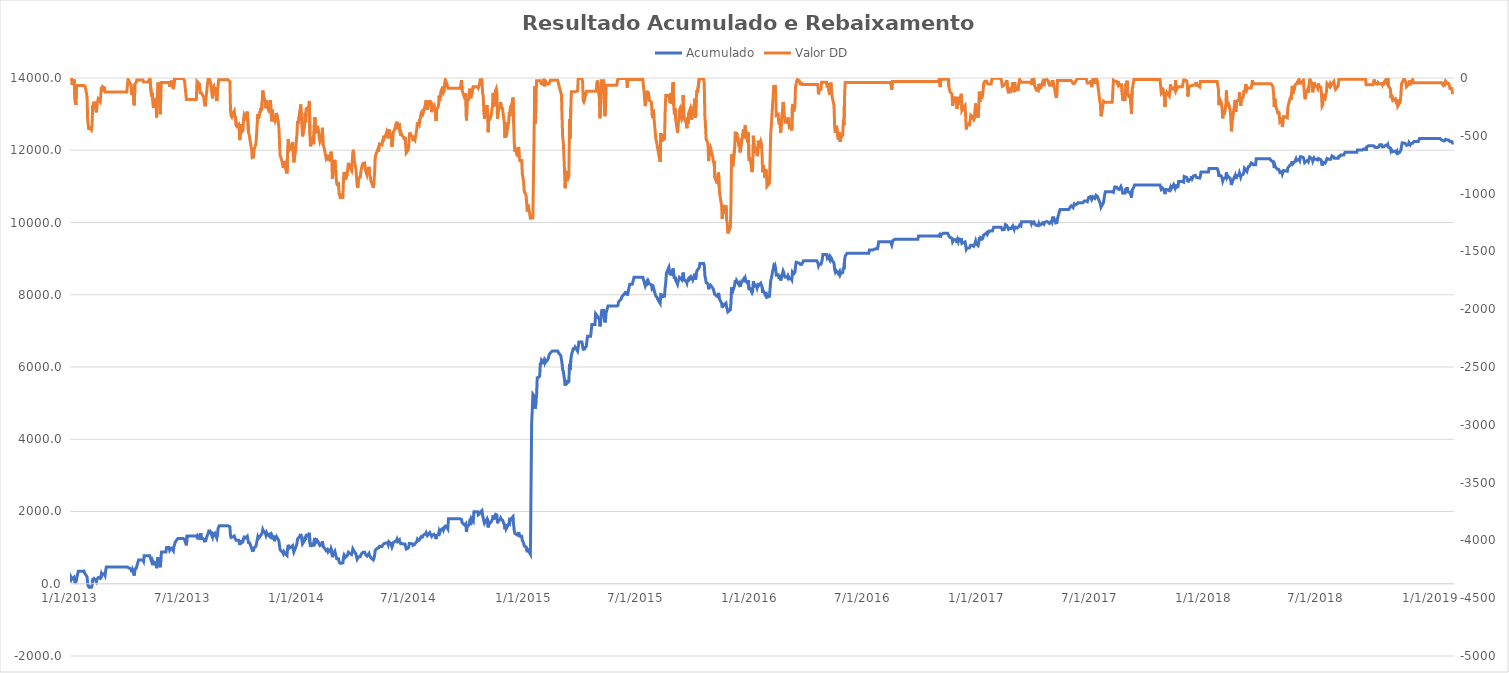
| Category | Acumulado |
|---|---|
| 1/1/13 | 35.924 |
| 1/2/13 | 193.591 |
| 1/3/13 | 193.591 |
| 1/4/13 | 134.082 |
| 1/7/13 | 181.261 |
| 1/8/13 | 203.592 |
| 1/9/13 | -5.087 |
| 1/10/13 | -28.987 |
| 1/11/13 | 139.129 |
| 1/14/13 | 346.97 |
| 1/15/13 | 346.97 |
| 1/16/13 | 346.97 |
| 1/17/13 | 346.97 |
| 1/18/13 | 346.97 |
| 1/21/13 | 346.97 |
| 1/22/13 | 353.367 |
| 1/23/13 | 353.367 |
| 1/24/13 | 295.1 |
| 1/25/13 | 278.069 |
| 1/28/13 | 193.644 |
| 1/29/13 | -18.116 |
| 1/30/13 | -22.686 |
| 1/31/13 | -94.511 |
| 2/1/13 | -76.66 |
| 2/4/13 | -96.696 |
| 2/5/13 | -59.321 |
| 2/6/13 | 119.973 |
| 2/7/13 | 109.122 |
| 2/8/13 | 148.708 |
| 2/11/13 | 85.345 |
| 2/12/13 | 56.277 |
| 2/13/13 | 130.277 |
| 2/14/13 | 148.881 |
| 2/15/13 | 171.766 |
| 2/18/13 | 147.479 |
| 2/19/13 | 194.505 |
| 2/20/13 | 275.873 |
| 2/21/13 | 232.84 |
| 2/22/13 | 278.613 |
| 2/25/13 | 269.126 |
| 2/26/13 | 232.235 |
| 2/27/13 | 373.669 |
| 2/28/13 | 463.713 |
| 3/1/13 | 463.713 |
| 3/4/13 | 463.713 |
| 3/5/13 | 463.713 |
| 3/6/13 | 463.713 |
| 3/7/13 | 463.713 |
| 3/8/13 | 463.713 |
| 3/10/13 | 463.713 |
| 3/11/13 | 463.713 |
| 3/12/13 | 463.713 |
| 3/13/13 | 463.713 |
| 3/14/13 | 463.713 |
| 3/17/13 | 463.713 |
| 3/18/13 | 463.713 |
| 3/19/13 | 463.713 |
| 3/20/13 | 463.713 |
| 3/21/13 | 463.713 |
| 3/24/13 | 463.713 |
| 3/25/13 | 463.713 |
| 3/26/13 | 463.713 |
| 3/27/13 | 463.713 |
| 3/28/13 | 463.713 |
| 3/31/13 | 463.713 |
| 4/1/13 | 463.713 |
| 4/2/13 | 463.713 |
| 4/3/13 | 463.713 |
| 4/4/13 | 452.145 |
| 4/7/13 | 420.279 |
| 4/8/13 | 426.033 |
| 4/9/13 | 402.838 |
| 4/10/13 | 320.18 |
| 4/11/13 | 385.693 |
| 4/14/13 | 227.54 |
| 4/15/13 | 411.034 |
| 4/16/13 | 414.414 |
| 4/17/13 | 423.625 |
| 4/18/13 | 446.005 |
| 4/21/13 | 659.697 |
| 4/22/13 | 659.697 |
| 4/23/13 | 659.697 |
| 4/24/13 | 659.697 |
| 4/25/13 | 659.697 |
| 4/28/13 | 659.697 |
| 4/29/13 | 624.514 |
| 4/30/13 | 773.092 |
| 5/1/13 | 773.092 |
| 5/2/13 | 773.092 |
| 5/5/13 | 773.092 |
| 5/6/13 | 773.092 |
| 5/7/13 | 773.092 |
| 5/8/13 | 773.092 |
| 5/9/13 | 772.973 |
| 5/12/13 | 609.939 |
| 5/13/13 | 646.454 |
| 5/14/13 | 640.856 |
| 5/15/13 | 513.25 |
| 5/16/13 | 596.945 |
| 5/19/13 | 562.109 |
| 5/20/13 | 430.948 |
| 5/21/13 | 599.901 |
| 5/22/13 | 733.536 |
| 5/23/13 | 708.63 |
| 5/26/13 | 459.218 |
| 5/27/13 | 734.531 |
| 5/28/13 | 879.025 |
| 5/29/13 | 879.025 |
| 5/30/13 | 879.025 |
| 6/2/13 | 879.025 |
| 6/3/13 | 879.025 |
| 6/4/13 | 879.025 |
| 6/5/13 | 1004.132 |
| 6/6/13 | 1004.132 |
| 6/9/13 | 1004.132 |
| 6/10/13 | 929.674 |
| 6/11/13 | 960.423 |
| 6/12/13 | 941.989 |
| 6/13/13 | 981.499 |
| 6/16/13 | 908.223 |
| 6/17/13 | 1035.223 |
| 6/18/13 | 1029.928 |
| 6/19/13 | 1153.081 |
| 6/20/13 | 1153.081 |
| 6/23/13 | 1249.296 |
| 6/24/13 | 1249.296 |
| 6/25/13 | 1249.296 |
| 6/26/13 | 1249.296 |
| 6/27/13 | 1249.296 |
| 6/30/13 | 1249.296 |
| 7/1/13 | 1249.296 |
| 7/2/13 | 1249.296 |
| 7/3/13 | 1249.296 |
| 7/4/13 | 1223.68 |
| 7/7/13 | 1063.529 |
| 7/8/13 | 1318.768 |
| 7/9/13 | 1318.768 |
| 7/10/13 | 1318.768 |
| 7/11/13 | 1318.768 |
| 7/14/13 | 1318.768 |
| 7/15/13 | 1318.768 |
| 7/16/13 | 1318.768 |
| 7/17/13 | 1318.768 |
| 7/18/13 | 1318.768 |
| 7/21/13 | 1318.768 |
| 7/22/13 | 1318.768 |
| 7/23/13 | 1318.768 |
| 7/24/13 | 1290.014 |
| 7/25/13 | 1338.351 |
| 7/28/13 | 1286.478 |
| 7/29/13 | 1210.967 |
| 7/30/13 | 1403.735 |
| 7/31/13 | 1276.597 |
| 8/1/13 | 1266.505 |
| 8/4/13 | 1234.441 |
| 8/5/13 | 1181.067 |
| 8/6/13 | 1159.601 |
| 8/7/13 | 1188.206 |
| 8/8/13 | 1254.797 |
| 8/11/13 | 1400.543 |
| 8/12/13 | 1460.644 |
| 8/13/13 | 1460.644 |
| 8/14/13 | 1462.845 |
| 8/15/13 | 1420.37 |
| 8/18/13 | 1286.429 |
| 8/19/13 | 1381.735 |
| 8/20/13 | 1390.51 |
| 8/21/13 | 1350.308 |
| 8/22/13 | 1384.157 |
| 8/25/13 | 1263.657 |
| 8/26/13 | 1355.015 |
| 8/27/13 | 1527.171 |
| 8/28/13 | 1512.417 |
| 8/29/13 | 1608.705 |
| 9/1/13 | 1608.705 |
| 9/2/13 | 1608.705 |
| 9/3/13 | 1608.705 |
| 9/4/13 | 1608.705 |
| 9/5/13 | 1608.705 |
| 9/8/13 | 1608.705 |
| 9/9/13 | 1608.705 |
| 9/10/13 | 1608.705 |
| 9/11/13 | 1608.705 |
| 9/12/13 | 1608.705 |
| 9/15/13 | 1575.956 |
| 9/16/13 | 1332.528 |
| 9/17/13 | 1281.831 |
| 9/18/13 | 1272.181 |
| 9/19/13 | 1294.046 |
| 9/22/13 | 1323.328 |
| 9/23/13 | 1265.939 |
| 9/24/13 | 1277.844 |
| 9/25/13 | 1202.712 |
| 9/26/13 | 1190.579 |
| 9/29/13 | 1206.885 |
| 9/30/13 | 1153.379 |
| 10/1/13 | 1071.219 |
| 10/2/13 | 1209.881 |
| 10/3/13 | 1133.276 |
| 10/6/13 | 1152.96 |
| 10/7/13 | 1254.446 |
| 10/8/13 | 1290.473 |
| 10/9/13 | 1290.508 |
| 10/10/13 | 1268.915 |
| 10/13/13 | 1318.459 |
| 10/14/13 | 1325.524 |
| 10/15/13 | 1134.928 |
| 10/16/13 | 1121.393 |
| 10/17/13 | 1124.182 |
| 10/20/13 | 985.223 |
| 10/21/13 | 919.876 |
| 10/22/13 | 928.524 |
| 10/23/13 | 924.35 |
| 10/24/13 | 991.152 |
| 10/27/13 | 1038.973 |
| 10/28/13 | 1044.533 |
| 10/29/13 | 1207.845 |
| 10/30/13 | 1297.535 |
| 10/31/13 | 1255.377 |
| 11/4/13 | 1347.261 |
| 11/5/13 | 1326.927 |
| 11/6/13 | 1406.265 |
| 11/7/13 | 1500.177 |
| 11/8/13 | 1461.247 |
| 11/11/13 | 1402.749 |
| 11/12/13 | 1346.999 |
| 11/13/13 | 1414.575 |
| 11/14/13 | 1388.936 |
| 11/15/13 | 1348.174 |
| 11/18/13 | 1308.44 |
| 11/19/13 | 1415.948 |
| 11/20/13 | 1364.153 |
| 11/21/13 | 1234.545 |
| 11/22/13 | 1334.999 |
| 11/25/13 | 1233.176 |
| 11/26/13 | 1267.975 |
| 11/27/13 | 1239.518 |
| 11/28/13 | 1254.329 |
| 11/29/13 | 1306.237 |
| 12/2/13 | 1221.273 |
| 12/3/13 | 1176.568 |
| 12/4/13 | 1045.498 |
| 12/5/13 | 934.694 |
| 12/6/13 | 925.286 |
| 12/9/13 | 864.209 |
| 12/10/13 | 830.544 |
| 12/11/13 | 888.557 |
| 12/12/13 | 876.387 |
| 12/13/13 | 837.48 |
| 12/16/13 | 782.126 |
| 12/17/13 | 993.294 |
| 12/18/13 | 1079.076 |
| 12/19/13 | 1025.88 |
| 12/20/13 | 989.168 |
| 12/23/13 | 1019.983 |
| 12/24/13 | 1030.455 |
| 12/25/13 | 1054.839 |
| 12/26/13 | 958.303 |
| 12/27/13 | 878.727 |
| 12/30/13 | 1004.161 |
| 12/31/13 | 1002.961 |
| 1/1/14 | 1115.296 |
| 1/2/14 | 1238.192 |
| 1/3/14 | 1214.62 |
| 1/6/14 | 1325.507 |
| 1/7/14 | 1379.887 |
| 1/8/14 | 1291.484 |
| 1/9/14 | 1197.554 |
| 1/10/14 | 1103.803 |
| 1/13/14 | 1189.004 |
| 1/14/14 | 1306.648 |
| 1/15/14 | 1224.102 |
| 1/16/14 | 1342.968 |
| 1/17/14 | 1346.812 |
| 1/20/14 | 1359.514 |
| 1/21/14 | 1410.457 |
| 1/22/14 | 1114.479 |
| 1/23/14 | 1017.781 |
| 1/24/14 | 1080.785 |
| 1/27/14 | 1099.776 |
| 1/28/14 | 1035.05 |
| 1/29/14 | 1205.057 |
| 1/30/14 | 1269.369 |
| 1/31/14 | 1131.593 |
| 2/3/14 | 1194.559 |
| 2/4/14 | 1188.778 |
| 2/5/14 | 1134.403 |
| 2/6/14 | 1088.989 |
| 2/7/14 | 1059.173 |
| 2/10/14 | 1102.17 |
| 2/11/14 | 1177.441 |
| 2/12/14 | 1032.708 |
| 2/13/14 | 1022.67 |
| 2/14/14 | 995.925 |
| 2/17/14 | 914.381 |
| 2/18/14 | 926.591 |
| 2/19/14 | 945.398 |
| 2/20/14 | 895.881 |
| 2/21/14 | 931.92 |
| 2/24/14 | 890.538 |
| 2/25/14 | 970.921 |
| 2/26/14 | 923.21 |
| 2/27/14 | 736.19 |
| 2/28/14 | 807.268 |
| 3/3/14 | 900.887 |
| 3/4/14 | 906.547 |
| 3/5/14 | 761.431 |
| 3/6/14 | 694.755 |
| 3/7/14 | 685.513 |
| 3/9/14 | 692.189 |
| 3/10/14 | 598.019 |
| 3/11/14 | 611.66 |
| 3/12/14 | 564.893 |
| 3/13/14 | 585.137 |
| 3/16/14 | 577.559 |
| 3/17/14 | 732.176 |
| 3/18/14 | 796.134 |
| 3/19/14 | 766.572 |
| 3/20/14 | 728.899 |
| 3/23/14 | 775.247 |
| 3/24/14 | 833.168 |
| 3/25/14 | 874.726 |
| 3/26/14 | 880.777 |
| 3/27/14 | 838.737 |
| 3/30/14 | 808.327 |
| 3/31/14 | 876.545 |
| 4/1/14 | 965.616 |
| 4/2/14 | 988.195 |
| 4/3/14 | 903.035 |
| 4/6/14 | 823.306 |
| 4/7/14 | 749.98 |
| 4/8/14 | 680.433 |
| 4/9/14 | 657.731 |
| 4/10/14 | 742.077 |
| 4/13/14 | 749.561 |
| 4/14/14 | 799.079 |
| 4/15/14 | 828.322 |
| 4/16/14 | 821.824 |
| 4/17/14 | 868.009 |
| 4/20/14 | 873.316 |
| 4/21/14 | 830.567 |
| 4/22/14 | 796.632 |
| 4/23/14 | 797.633 |
| 4/24/14 | 767.229 |
| 4/27/14 | 840.119 |
| 4/28/14 | 778.713 |
| 4/29/14 | 758.162 |
| 4/30/14 | 722.762 |
| 5/1/14 | 719.643 |
| 5/4/14 | 659.574 |
| 5/5/14 | 700.276 |
| 5/6/14 | 784.001 |
| 5/7/14 | 913.601 |
| 5/8/14 | 943.962 |
| 5/11/14 | 987.819 |
| 5/12/14 | 969.931 |
| 5/13/14 | 998.584 |
| 5/14/14 | 1037.97 |
| 5/15/14 | 1032.07 |
| 5/18/14 | 1029.508 |
| 5/19/14 | 1067.917 |
| 5/20/14 | 1084.265 |
| 5/21/14 | 1109.88 |
| 5/22/14 | 1091.421 |
| 5/25/14 | 1131.537 |
| 5/26/14 | 1150.544 |
| 5/27/14 | 1140.139 |
| 5/28/14 | 1086.262 |
| 5/29/14 | 1163.4 |
| 6/1/14 | 1113.689 |
| 6/2/14 | 1128.549 |
| 6/3/14 | 1012.635 |
| 6/4/14 | 1058.69 |
| 6/5/14 | 1136.16 |
| 6/8/14 | 1174.387 |
| 6/9/14 | 1198.314 |
| 6/10/14 | 1189.242 |
| 6/11/14 | 1230.581 |
| 6/12/14 | 1168.97 |
| 6/15/14 | 1218.155 |
| 6/16/14 | 1139.579 |
| 6/17/14 | 1110.904 |
| 6/18/14 | 1127.949 |
| 6/19/14 | 1112.655 |
| 6/22/14 | 1096.106 |
| 6/23/14 | 1074.848 |
| 6/24/14 | 1098.869 |
| 6/25/14 | 1036.974 |
| 6/26/14 | 960.664 |
| 6/29/14 | 983.422 |
| 6/30/14 | 1016.567 |
| 7/1/14 | 1113.567 |
| 7/2/14 | 1137.262 |
| 7/3/14 | 1114.243 |
| 7/6/14 | 1102.871 |
| 7/7/14 | 1062.148 |
| 7/8/14 | 1086.302 |
| 7/9/14 | 1082.487 |
| 7/10/14 | 1070.503 |
| 7/13/14 | 1165.502 |
| 7/14/14 | 1225.089 |
| 7/15/14 | 1196.576 |
| 7/16/14 | 1218.514 |
| 7/17/14 | 1206.433 |
| 7/20/14 | 1301.999 |
| 7/21/14 | 1294.667 |
| 7/22/14 | 1291.722 |
| 7/23/14 | 1338.244 |
| 7/24/14 | 1321.566 |
| 7/27/14 | 1382.484 |
| 7/28/14 | 1416.926 |
| 7/29/14 | 1410.893 |
| 7/30/14 | 1332.912 |
| 7/31/14 | 1359.87 |
| 8/3/14 | 1418.109 |
| 8/4/14 | 1378.731 |
| 8/5/14 | 1403.342 |
| 8/6/14 | 1313.688 |
| 8/7/14 | 1343.688 |
| 8/10/14 | 1370.004 |
| 8/11/14 | 1342.842 |
| 8/12/14 | 1323.829 |
| 8/13/14 | 1236.92 |
| 8/14/14 | 1331.405 |
| 8/17/14 | 1367.368 |
| 8/18/14 | 1455.984 |
| 8/19/14 | 1409.399 |
| 8/20/14 | 1460 |
| 8/21/14 | 1495.585 |
| 8/24/14 | 1534.154 |
| 8/25/14 | 1481.991 |
| 8/26/14 | 1491.564 |
| 8/27/14 | 1564.999 |
| 8/28/14 | 1593.3 |
| 8/31/14 | 1551.135 |
| 9/1/14 | 1520.709 |
| 9/2/14 | 1798.663 |
| 9/3/14 | 1798.663 |
| 9/4/14 | 1798.663 |
| 9/7/14 | 1798.663 |
| 9/8/14 | 1798.663 |
| 9/9/14 | 1798.663 |
| 9/10/14 | 1798.663 |
| 9/11/14 | 1798.663 |
| 9/14/14 | 1798.663 |
| 9/15/14 | 1798.663 |
| 9/16/14 | 1798.663 |
| 9/17/14 | 1798.663 |
| 9/18/14 | 1798.663 |
| 9/21/14 | 1798.663 |
| 9/22/14 | 1798.663 |
| 9/23/14 | 1781.113 |
| 9/24/14 | 1694.558 |
| 9/25/14 | 1698.223 |
| 9/28/14 | 1627.023 |
| 9/29/14 | 1614.209 |
| 9/30/14 | 1663.939 |
| 10/1/14 | 1432.293 |
| 10/2/14 | 1591.07 |
| 10/5/14 | 1619.407 |
| 10/6/14 | 1706.204 |
| 10/7/14 | 1665.065 |
| 10/8/14 | 1623.719 |
| 10/9/14 | 1809.202 |
| 10/12/14 | 1733.607 |
| 10/13/14 | 1993.548 |
| 10/14/14 | 1993.548 |
| 10/15/14 | 1993.548 |
| 10/16/14 | 1993.548 |
| 10/19/14 | 1993.548 |
| 10/20/14 | 1908.246 |
| 10/21/14 | 1905.6 |
| 10/22/14 | 1938.102 |
| 10/23/14 | 1977.741 |
| 10/26/14 | 2027.43 |
| 10/27/14 | 1893.519 |
| 10/28/14 | 1874.383 |
| 10/29/14 | 1739.325 |
| 10/30/14 | 1674.842 |
| 11/3/14 | 1792.768 |
| 11/4/14 | 1708.608 |
| 11/5/14 | 1558.763 |
| 11/6/14 | 1697.577 |
| 11/7/14 | 1660.951 |
| 11/10/14 | 1714.701 |
| 11/11/14 | 1715.014 |
| 11/12/14 | 1793.014 |
| 11/13/14 | 1898.57 |
| 11/14/14 | 1780.931 |
| 11/17/14 | 1920.722 |
| 11/18/14 | 1934.669 |
| 11/19/14 | 1903.246 |
| 11/20/14 | 1673.462 |
| 11/21/14 | 1733.413 |
| 11/24/14 | 1782.093 |
| 11/25/14 | 1818.487 |
| 11/26/14 | 1778.85 |
| 11/27/14 | 1782.114 |
| 11/28/14 | 1764.834 |
| 12/1/14 | 1637.893 |
| 12/2/14 | 1509.044 |
| 12/3/14 | 1641.45 |
| 12/4/14 | 1519.938 |
| 12/5/14 | 1552.415 |
| 12/8/14 | 1645.731 |
| 12/9/14 | 1733.126 |
| 12/10/14 | 1697.154 |
| 12/11/14 | 1786.545 |
| 12/12/14 | 1772.118 |
| 12/15/14 | 1858.683 |
| 12/16/14 | 1636.178 |
| 12/17/14 | 1468.961 |
| 12/18/14 | 1390.892 |
| 12/19/14 | 1409.528 |
| 12/22/14 | 1349.095 |
| 12/23/14 | 1378.276 |
| 12/24/14 | 1431.311 |
| 12/25/14 | 1343.619 |
| 12/26/14 | 1312.581 |
| 12/29/14 | 1313.367 |
| 12/30/14 | 1199.275 |
| 12/31/14 | 1199.66 |
| 1/1/15 | 1131.154 |
| 1/2/15 | 1048.423 |
| 1/5/15 | 1013.971 |
| 1/6/15 | 944.137 |
| 1/7/15 | 872.053 |
| 1/8/15 | 931.263 |
| 1/9/15 | 912.109 |
| 1/12/15 | 814.023 |
| 1/13/15 | 815.334 |
| 1/14/15 | 4434.316 |
| 1/15/15 | 4814.847 |
| 1/16/15 | 5245.042 |
| 1/19/15 | 5172.838 |
| 1/20/15 | 4847.077 |
| 1/21/15 | 5064.994 |
| 1/22/15 | 5221.663 |
| 1/23/15 | 5700.365 |
| 1/26/15 | 5724.317 |
| 1/27/15 | 5753.706 |
| 1/28/15 | 6114.161 |
| 1/29/15 | 6066.794 |
| 1/30/15 | 6191.965 |
| 2/2/15 | 6134.614 |
| 2/3/15 | 6185.459 |
| 2/4/15 | 6120.568 |
| 2/5/15 | 6175.301 |
| 2/6/15 | 6141.875 |
| 2/9/15 | 6206.832 |
| 2/10/15 | 6250.15 |
| 2/11/15 | 6328.631 |
| 2/12/15 | 6366.263 |
| 2/13/15 | 6346.563 |
| 2/16/15 | 6441.501 |
| 2/17/15 | 6441.501 |
| 2/18/15 | 6441.501 |
| 2/19/15 | 6441.501 |
| 2/20/15 | 6441.501 |
| 2/23/15 | 6441.501 |
| 2/24/15 | 6441.501 |
| 2/25/15 | 6441.501 |
| 2/26/15 | 6441.501 |
| 2/27/15 | 6374.764 |
| 3/2/15 | 6316.334 |
| 3/3/15 | 6298.944 |
| 3/4/15 | 6095.499 |
| 3/5/15 | 5919.413 |
| 3/6/15 | 5887.692 |
| 3/8/15 | 5631.928 |
| 3/9/15 | 5487.403 |
| 3/10/15 | 5637.168 |
| 3/11/15 | 5622.814 |
| 3/12/15 | 5549.091 |
| 3/15/15 | 5601.72 |
| 3/16/15 | 6087.75 |
| 3/17/15 | 5915.213 |
| 3/18/15 | 6175.829 |
| 3/19/15 | 6323.555 |
| 3/22/15 | 6507.499 |
| 3/23/15 | 6507.499 |
| 3/24/15 | 6507.499 |
| 3/25/15 | 6549.422 |
| 3/26/15 | 6549.422 |
| 3/29/15 | 6437.785 |
| 3/30/15 | 6544.677 |
| 3/31/15 | 6689.615 |
| 4/1/15 | 6689.615 |
| 4/2/15 | 6689.615 |
| 4/5/15 | 6689.615 |
| 4/6/15 | 6662.441 |
| 4/7/15 | 6492.021 |
| 4/8/15 | 6482.259 |
| 4/9/15 | 6498.167 |
| 4/12/15 | 6575.309 |
| 4/13/15 | 6714.054 |
| 4/14/15 | 6851.359 |
| 4/15/15 | 6851.359 |
| 4/16/15 | 6851.359 |
| 4/19/15 | 6851.359 |
| 4/20/15 | 6851.359 |
| 4/21/15 | 7179.139 |
| 4/22/15 | 7179.139 |
| 4/23/15 | 7179.139 |
| 4/26/15 | 7179.139 |
| 4/27/15 | 7474.763 |
| 4/28/15 | 7474.763 |
| 4/29/15 | 7429.808 |
| 4/30/15 | 7452.541 |
| 5/3/15 | 7318.17 |
| 5/4/15 | 7126.332 |
| 5/5/15 | 7235.082 |
| 5/6/15 | 7450.696 |
| 5/7/15 | 7565.208 |
| 5/10/15 | 7565.208 |
| 5/11/15 | 7321.712 |
| 5/12/15 | 7234.435 |
| 5/13/15 | 7294.801 |
| 5/14/15 | 7502.309 |
| 5/17/15 | 7688.441 |
| 5/18/15 | 7688.441 |
| 5/19/15 | 7688.441 |
| 5/20/15 | 7688.441 |
| 5/21/15 | 7688.441 |
| 5/24/15 | 7688.441 |
| 5/25/15 | 7688.441 |
| 5/26/15 | 7688.441 |
| 5/27/15 | 7688.441 |
| 5/28/15 | 7688.441 |
| 5/31/15 | 7688.441 |
| 6/1/15 | 7708.109 |
| 6/2/15 | 7704.12 |
| 6/3/15 | 7804.177 |
| 6/4/15 | 7804.177 |
| 6/7/15 | 7875.796 |
| 6/8/15 | 7926.711 |
| 6/9/15 | 7964.021 |
| 6/10/15 | 7964.021 |
| 6/11/15 | 7995.183 |
| 6/14/15 | 8064.712 |
| 6/15/15 | 8064.712 |
| 6/16/15 | 8058.816 |
| 6/17/15 | 7980.23 |
| 6/18/15 | 8050.982 |
| 6/21/15 | 8287.528 |
| 6/22/15 | 8287.528 |
| 6/23/15 | 8287.528 |
| 6/24/15 | 8287.528 |
| 6/25/15 | 8287.528 |
| 6/28/15 | 8486.371 |
| 6/29/15 | 8486.371 |
| 6/30/15 | 8486.371 |
| 7/1/15 | 8486.371 |
| 7/2/15 | 8486.371 |
| 7/5/15 | 8486.371 |
| 7/6/15 | 8486.371 |
| 7/7/15 | 8486.371 |
| 7/8/15 | 8486.371 |
| 7/9/15 | 8486.371 |
| 7/12/15 | 8486.371 |
| 7/13/15 | 8486.371 |
| 7/14/15 | 8368.914 |
| 7/15/15 | 8301.072 |
| 7/16/15 | 8242.946 |
| 7/19/15 | 8375.496 |
| 7/20/15 | 8327.96 |
| 7/21/15 | 8363.662 |
| 7/22/15 | 8305.126 |
| 7/23/15 | 8289.434 |
| 7/26/15 | 8277.064 |
| 7/27/15 | 8166.371 |
| 7/28/15 | 8139.017 |
| 7/29/15 | 8212.335 |
| 7/30/15 | 8141.394 |
| 8/2/15 | 7959.616 |
| 8/3/15 | 7936.849 |
| 8/4/15 | 7928.224 |
| 8/5/15 | 7878.204 |
| 8/6/15 | 7846.05 |
| 8/9/15 | 7760.651 |
| 8/10/15 | 8007.928 |
| 8/11/15 | 7990.842 |
| 8/12/15 | 7995.636 |
| 8/13/15 | 7947.037 |
| 8/16/15 | 7958.795 |
| 8/17/15 | 8193.314 |
| 8/18/15 | 8334.928 |
| 8/19/15 | 8594.674 |
| 8/20/15 | 8594.674 |
| 8/23/15 | 8760.604 |
| 8/24/15 | 8760.604 |
| 8/25/15 | 8544.815 |
| 8/26/15 | 8629.016 |
| 8/27/15 | 8538.451 |
| 8/30/15 | 8724.783 |
| 8/31/15 | 8519.7 |
| 9/1/15 | 8442.015 |
| 9/2/15 | 8498.818 |
| 9/3/15 | 8401.595 |
| 9/6/15 | 8286.95 |
| 9/7/15 | 8374.039 |
| 9/8/15 | 8393.353 |
| 9/9/15 | 8481.412 |
| 9/10/15 | 8495.098 |
| 9/13/15 | 8407.273 |
| 9/14/15 | 8420.925 |
| 9/15/15 | 8614.253 |
| 9/16/15 | 8472.422 |
| 9/17/15 | 8405.588 |
| 9/20/15 | 8372.141 |
| 9/21/15 | 8326.129 |
| 9/22/15 | 8420.168 |
| 9/23/15 | 8363.023 |
| 9/24/15 | 8459.064 |
| 9/27/15 | 8503.888 |
| 9/28/15 | 8482.337 |
| 9/29/15 | 8400.176 |
| 9/30/15 | 8510.776 |
| 10/1/15 | 8431.838 |
| 10/4/15 | 8581.727 |
| 10/5/15 | 8419.58 |
| 10/6/15 | 8565.386 |
| 10/7/15 | 8653.686 |
| 10/8/15 | 8630.728 |
| 10/11/15 | 8756.172 |
| 10/12/15 | 8866.258 |
| 10/13/15 | 8866.258 |
| 10/14/15 | 8866.258 |
| 10/15/15 | 8866.258 |
| 10/18/15 | 8868.248 |
| 10/19/15 | 8814.045 |
| 10/20/15 | 8538.34 |
| 10/21/15 | 8455.609 |
| 10/22/15 | 8339.139 |
| 10/25/15 | 8302.425 |
| 10/26/15 | 8151.433 |
| 10/27/15 | 8233.42 |
| 10/28/15 | 8231.275 |
| 10/29/15 | 8265.458 |
| 11/2/15 | 8174.485 |
| 11/3/15 | 8132.892 |
| 11/4/15 | 8148.728 |
| 11/5/15 | 8006.944 |
| 11/6/15 | 8012.391 |
| 11/9/15 | 7955.489 |
| 11/10/15 | 7962.214 |
| 11/11/15 | 8050.655 |
| 11/12/15 | 7925.78 |
| 11/13/15 | 7862.615 |
| 11/16/15 | 7759.834 |
| 11/17/15 | 7648.526 |
| 11/18/15 | 7770.661 |
| 11/19/15 | 7697.247 |
| 11/20/15 | 7720.347 |
| 11/23/15 | 7766.001 |
| 11/24/15 | 7645.491 |
| 11/25/15 | 7615.895 |
| 11/26/15 | 7524.102 |
| 11/27/15 | 7528.634 |
| 11/30/15 | 7581.209 |
| 12/1/15 | 7772.958 |
| 12/2/15 | 8206.665 |
| 12/3/15 | 8145.42 |
| 12/4/15 | 8102.49 |
| 12/7/15 | 8266.049 |
| 12/8/15 | 8403.488 |
| 12/9/15 | 8314.615 |
| 12/10/15 | 8394.702 |
| 12/11/15 | 8373.849 |
| 12/14/15 | 8274.599 |
| 12/15/15 | 8311.939 |
| 12/16/15 | 8225.098 |
| 12/17/15 | 8314.971 |
| 12/18/15 | 8304.869 |
| 12/21/15 | 8423.291 |
| 12/22/15 | 8347.715 |
| 12/23/15 | 8410.257 |
| 12/24/15 | 8459.478 |
| 12/25/15 | 8389.14 |
| 12/28/15 | 8312.002 |
| 12/29/15 | 8399.322 |
| 12/30/15 | 8165.203 |
| 12/31/15 | 8165.203 |
| 1/1/16 | 8168.896 |
| 1/4/16 | 8054.045 |
| 1/5/16 | 8096.646 |
| 1/6/16 | 8369.115 |
| 1/7/16 | 8377.046 |
| 1/8/16 | 8234.416 |
| 1/11/16 | 8252.314 |
| 1/12/16 | 8192.312 |
| 1/13/16 | 8206.584 |
| 1/14/16 | 8325.649 |
| 1/15/16 | 8261.195 |
| 1/18/16 | 8320.612 |
| 1/19/16 | 8302.459 |
| 1/20/16 | 8223.275 |
| 1/21/16 | 8054.168 |
| 1/22/16 | 8115.724 |
| 1/25/16 | 8006.091 |
| 1/26/16 | 8077.46 |
| 1/27/16 | 8058.317 |
| 1/28/16 | 7930.148 |
| 1/29/16 | 7924.82 |
| 2/1/16 | 7958.612 |
| 2/2/16 | 8163.633 |
| 2/3/16 | 8382.959 |
| 2/4/16 | 8453.399 |
| 2/5/16 | 8545.373 |
| 2/8/16 | 8802.516 |
| 2/9/16 | 8773.34 |
| 2/10/16 | 8808.028 |
| 2/11/16 | 8723.92 |
| 2/12/16 | 8544.591 |
| 2/15/16 | 8553.783 |
| 2/16/16 | 8482.617 |
| 2/17/16 | 8465.007 |
| 2/18/16 | 8501.15 |
| 2/19/16 | 8394.608 |
| 2/22/16 | 8587.956 |
| 2/23/16 | 8660.472 |
| 2/24/16 | 8621.103 |
| 2/25/16 | 8541.141 |
| 2/26/16 | 8489.686 |
| 2/29/16 | 8499.903 |
| 3/1/16 | 8472.107 |
| 3/2/16 | 8526.112 |
| 3/3/16 | 8487.091 |
| 3/4/16 | 8438.458 |
| 3/7/16 | 8445.379 |
| 3/8/16 | 8414.779 |
| 3/9/16 | 8626.184 |
| 3/10/16 | 8643.213 |
| 3/11/16 | 8578.833 |
| 3/13/16 | 8624.363 |
| 3/14/16 | 8790.548 |
| 3/15/16 | 8899.116 |
| 3/16/16 | 8873.823 |
| 3/17/16 | 8887.014 |
| 3/20/16 | 8875.77 |
| 3/21/16 | 8855.228 |
| 3/22/16 | 8837.307 |
| 3/23/16 | 8861.702 |
| 3/24/16 | 8843.677 |
| 3/27/16 | 8942.408 |
| 3/28/16 | 8942.408 |
| 3/29/16 | 8942.408 |
| 3/30/16 | 8942.408 |
| 3/31/16 | 8942.408 |
| 4/3/16 | 8942.408 |
| 4/4/16 | 8942.408 |
| 4/5/16 | 8942.408 |
| 4/6/16 | 8942.408 |
| 4/7/16 | 8942.408 |
| 4/10/16 | 8942.408 |
| 4/11/16 | 8942.408 |
| 4/12/16 | 8942.408 |
| 4/13/16 | 8942.408 |
| 4/14/16 | 8942.408 |
| 4/17/16 | 8942.408 |
| 4/18/16 | 8942.408 |
| 4/19/16 | 8886.997 |
| 4/20/16 | 8801.472 |
| 4/21/16 | 8843.825 |
| 4/24/16 | 8844.499 |
| 4/25/16 | 8904.808 |
| 4/26/16 | 8970.739 |
| 4/27/16 | 9112.326 |
| 4/28/16 | 9112.326 |
| 5/1/16 | 9112.326 |
| 5/2/16 | 9112.326 |
| 5/3/16 | 9112.326 |
| 5/4/16 | 9031.544 |
| 5/5/16 | 9067.46 |
| 5/8/16 | 8966.309 |
| 5/9/16 | 9059.252 |
| 5/10/16 | 9072.373 |
| 5/11/16 | 9008.813 |
| 5/12/16 | 8948.314 |
| 5/15/16 | 8874.646 |
| 5/16/16 | 8696.599 |
| 5/17/16 | 8637.241 |
| 5/18/16 | 8676.94 |
| 5/19/16 | 8699.222 |
| 5/22/16 | 8579.56 |
| 5/23/16 | 8599.165 |
| 5/24/16 | 8644.311 |
| 5/25/16 | 8559.049 |
| 5/26/16 | 8598.88 |
| 5/29/16 | 8616.691 |
| 5/30/16 | 8747.89 |
| 5/31/16 | 8703.863 |
| 6/1/16 | 8954.491 |
| 6/2/16 | 9073.728 |
| 6/5/16 | 9146.954 |
| 6/6/16 | 9146.954 |
| 6/7/16 | 9146.954 |
| 6/8/16 | 9146.954 |
| 6/9/16 | 9146.954 |
| 6/12/16 | 9146.954 |
| 6/13/16 | 9146.954 |
| 6/14/16 | 9146.954 |
| 6/15/16 | 9146.954 |
| 6/16/16 | 9146.954 |
| 6/19/16 | 9146.954 |
| 6/20/16 | 9146.954 |
| 6/21/16 | 9146.954 |
| 6/22/16 | 9146.954 |
| 6/23/16 | 9146.954 |
| 6/26/16 | 9146.954 |
| 6/27/16 | 9146.954 |
| 6/28/16 | 9146.954 |
| 6/29/16 | 9146.954 |
| 6/30/16 | 9146.954 |
| 7/3/16 | 9146.954 |
| 7/4/16 | 9146.954 |
| 7/5/16 | 9146.954 |
| 7/6/16 | 9146.954 |
| 7/7/16 | 9146.954 |
| 7/10/16 | 9146.954 |
| 7/11/16 | 9241.125 |
| 7/12/16 | 9241.125 |
| 7/13/16 | 9241.125 |
| 7/14/16 | 9241.125 |
| 7/17/16 | 9241.125 |
| 7/18/16 | 9241.125 |
| 7/19/16 | 9261.321 |
| 7/20/16 | 9274.654 |
| 7/21/16 | 9274.654 |
| 7/24/16 | 9274.654 |
| 7/25/16 | 9359.25 |
| 7/26/16 | 9464.518 |
| 7/27/16 | 9464.518 |
| 7/28/16 | 9464.518 |
| 7/31/16 | 9464.518 |
| 8/1/16 | 9464.518 |
| 8/2/16 | 9464.518 |
| 8/3/16 | 9464.518 |
| 8/4/16 | 9464.518 |
| 8/7/16 | 9464.518 |
| 8/8/16 | 9464.518 |
| 8/9/16 | 9464.518 |
| 8/10/16 | 9464.518 |
| 8/11/16 | 9464.518 |
| 8/14/16 | 9464.518 |
| 8/15/16 | 9473.06 |
| 8/16/16 | 9372.849 |
| 8/17/16 | 9443.839 |
| 8/18/16 | 9504.915 |
| 8/21/16 | 9534.626 |
| 8/22/16 | 9534.626 |
| 8/23/16 | 9534.626 |
| 8/24/16 | 9534.626 |
| 8/25/16 | 9534.626 |
| 8/28/16 | 9534.626 |
| 8/29/16 | 9534.626 |
| 8/30/16 | 9534.626 |
| 8/31/16 | 9534.626 |
| 9/1/16 | 9534.626 |
| 9/4/16 | 9534.626 |
| 9/5/16 | 9534.626 |
| 9/6/16 | 9534.626 |
| 9/7/16 | 9534.626 |
| 9/8/16 | 9534.626 |
| 9/11/16 | 9534.626 |
| 9/12/16 | 9534.626 |
| 9/13/16 | 9534.626 |
| 9/14/16 | 9534.626 |
| 9/15/16 | 9534.626 |
| 9/18/16 | 9534.626 |
| 9/19/16 | 9534.626 |
| 9/20/16 | 9534.626 |
| 9/21/16 | 9534.626 |
| 9/22/16 | 9534.626 |
| 9/25/16 | 9534.626 |
| 9/26/16 | 9534.626 |
| 9/27/16 | 9534.626 |
| 9/28/16 | 9624.812 |
| 9/29/16 | 9624.812 |
| 10/2/16 | 9624.812 |
| 10/3/16 | 9624.812 |
| 10/4/16 | 9624.812 |
| 10/5/16 | 9624.812 |
| 10/6/16 | 9624.812 |
| 10/9/16 | 9624.812 |
| 10/10/16 | 9624.812 |
| 10/11/16 | 9624.812 |
| 10/12/16 | 9624.812 |
| 10/13/16 | 9624.812 |
| 10/16/16 | 9624.812 |
| 10/17/16 | 9624.812 |
| 10/18/16 | 9624.812 |
| 10/19/16 | 9624.812 |
| 10/20/16 | 9624.812 |
| 10/23/16 | 9624.812 |
| 10/24/16 | 9624.812 |
| 10/25/16 | 9624.812 |
| 10/26/16 | 9624.812 |
| 10/27/16 | 9624.812 |
| 10/30/16 | 9624.812 |
| 10/31/16 | 9609.584 |
| 11/1/16 | 9663.611 |
| 11/2/16 | 9584.732 |
| 11/3/16 | 9652.097 |
| 11/7/16 | 9702.837 |
| 11/8/16 | 9702.837 |
| 11/9/16 | 9702.837 |
| 11/10/16 | 9702.837 |
| 11/11/16 | 9702.837 |
| 11/14/16 | 9702.837 |
| 11/15/16 | 9702.506 |
| 11/16/16 | 9630.68 |
| 11/17/16 | 9598.234 |
| 11/18/16 | 9582.196 |
| 11/21/16 | 9562.518 |
| 11/22/16 | 9462.604 |
| 11/23/16 | 9463.865 |
| 11/24/16 | 9520.053 |
| 11/25/16 | 9532.257 |
| 11/28/16 | 9529.946 |
| 11/29/16 | 9434.399 |
| 11/30/16 | 9516.16 |
| 12/1/16 | 9470.67 |
| 12/2/16 | 9539.452 |
| 12/5/16 | 9498.223 |
| 12/6/16 | 9565.6 |
| 12/7/16 | 9421.517 |
| 12/8/16 | 9415.601 |
| 12/9/16 | 9441.462 |
| 12/12/16 | 9464.169 |
| 12/13/16 | 9367.069 |
| 12/14/16 | 9258.459 |
| 12/15/16 | 9287.982 |
| 12/16/16 | 9302.983 |
| 12/19/16 | 9296.802 |
| 12/20/16 | 9328.83 |
| 12/21/16 | 9371.185 |
| 12/22/16 | 9360.96 |
| 12/23/16 | 9369.734 |
| 12/26/16 | 9341.142 |
| 12/27/16 | 9352.323 |
| 12/28/16 | 9425.833 |
| 12/29/16 | 9482.089 |
| 12/30/16 | 9411.202 |
| 1/2/17 | 9359.267 |
| 1/3/17 | 9438.68 |
| 1/4/17 | 9583.695 |
| 1/5/17 | 9497.02 |
| 1/6/17 | 9583.331 |
| 1/9/17 | 9550.498 |
| 1/10/17 | 9584.455 |
| 1/11/17 | 9654.223 |
| 1/12/17 | 9652.661 |
| 1/13/17 | 9675.262 |
| 1/16/17 | 9720.688 |
| 1/17/17 | 9673.564 |
| 1/18/17 | 9669.267 |
| 1/19/17 | 9735.338 |
| 1/20/17 | 9768.142 |
| 1/23/17 | 9768.142 |
| 1/24/17 | 9755.918 |
| 1/25/17 | 9765.506 |
| 1/26/17 | 9786.872 |
| 1/27/17 | 9868.744 |
| 1/30/17 | 9868.744 |
| 1/31/17 | 9868.744 |
| 2/1/17 | 9868.744 |
| 2/2/17 | 9868.744 |
| 2/3/17 | 9868.744 |
| 2/6/17 | 9868.744 |
| 2/7/17 | 9868.744 |
| 2/8/17 | 9868.744 |
| 2/9/17 | 9862.381 |
| 2/10/17 | 9797.395 |
| 2/13/17 | 9805.728 |
| 2/14/17 | 9817.807 |
| 2/15/17 | 9942.874 |
| 2/16/17 | 9942.874 |
| 2/17/17 | 9924.585 |
| 2/20/17 | 9810.819 |
| 2/21/17 | 9807.839 |
| 2/22/17 | 9843.066 |
| 2/23/17 | 9850.948 |
| 2/24/17 | 9831.929 |
| 2/27/17 | 9905.988 |
| 2/28/17 | 9882.181 |
| 3/1/17 | 9819.896 |
| 3/2/17 | 9904.739 |
| 3/3/17 | 9848.702 |
| 3/6/17 | 9843.702 |
| 3/7/17 | 9830.275 |
| 3/8/17 | 9876.648 |
| 3/9/17 | 9904.431 |
| 3/10/17 | 9932.351 |
| 3/12/17 | 9907.008 |
| 3/13/17 | 10024.179 |
| 3/14/17 | 10024.179 |
| 3/15/17 | 10024.179 |
| 3/16/17 | 10024.179 |
| 3/19/17 | 10024.179 |
| 3/20/17 | 10024.179 |
| 3/21/17 | 10024.179 |
| 3/22/17 | 10024.179 |
| 3/23/17 | 10024.179 |
| 3/26/17 | 10024.179 |
| 3/27/17 | 10024.179 |
| 3/28/17 | 10024.179 |
| 3/29/17 | 9965.995 |
| 3/30/17 | 10011.57 |
| 4/2/17 | 10019.614 |
| 4/3/17 | 9958.16 |
| 4/4/17 | 9961.205 |
| 4/5/17 | 9930.686 |
| 4/6/17 | 9919.003 |
| 4/9/17 | 9912.505 |
| 4/10/17 | 9974.388 |
| 4/11/17 | 9934.911 |
| 4/12/17 | 9928.579 |
| 4/13/17 | 9936.372 |
| 4/16/17 | 9990.412 |
| 4/17/17 | 9980.699 |
| 4/18/17 | 9954.025 |
| 4/19/17 | 10006.356 |
| 4/20/17 | 10010.283 |
| 4/23/17 | 10027.423 |
| 4/24/17 | 10036.89 |
| 4/25/17 | 10010.124 |
| 4/26/17 | 9985.532 |
| 4/27/17 | 9973.636 |
| 4/30/17 | 10037.76 |
| 5/1/17 | 10006.594 |
| 5/2/17 | 10131.601 |
| 5/3/17 | 10131.601 |
| 5/4/17 | 10131.601 |
| 5/7/17 | 9986.582 |
| 5/8/17 | 9959.349 |
| 5/9/17 | 9997.377 |
| 5/10/17 | 10109.009 |
| 5/11/17 | 10182.568 |
| 5/14/17 | 10357.838 |
| 5/15/17 | 10357.838 |
| 5/16/17 | 10357.838 |
| 5/17/17 | 10357.838 |
| 5/18/17 | 10357.838 |
| 5/21/17 | 10357.838 |
| 5/22/17 | 10357.838 |
| 5/23/17 | 10357.838 |
| 5/24/17 | 10357.838 |
| 5/25/17 | 10357.838 |
| 5/28/17 | 10357.838 |
| 5/29/17 | 10357.838 |
| 5/30/17 | 10416.014 |
| 5/31/17 | 10416.014 |
| 6/1/17 | 10461.434 |
| 6/4/17 | 10412.926 |
| 6/5/17 | 10479.688 |
| 6/6/17 | 10519.725 |
| 6/7/17 | 10519.725 |
| 6/8/17 | 10489.929 |
| 6/11/17 | 10515.3 |
| 6/12/17 | 10549.874 |
| 6/13/17 | 10549.874 |
| 6/14/17 | 10549.874 |
| 6/15/17 | 10549.874 |
| 6/18/17 | 10549.874 |
| 6/19/17 | 10549.874 |
| 6/20/17 | 10549.874 |
| 6/21/17 | 10549.874 |
| 6/22/17 | 10597.217 |
| 6/25/17 | 10597.217 |
| 6/26/17 | 10620.917 |
| 6/27/17 | 10576.727 |
| 6/28/17 | 10628.323 |
| 6/29/17 | 10692.846 |
| 7/2/17 | 10716.231 |
| 7/3/17 | 10697.811 |
| 7/4/17 | 10637.71 |
| 7/5/17 | 10679.804 |
| 7/6/17 | 10712.191 |
| 7/9/17 | 10666.564 |
| 7/10/17 | 10704.866 |
| 7/11/17 | 10753.917 |
| 7/12/17 | 10753.917 |
| 7/13/17 | 10728.374 |
| 7/16/17 | 10599.362 |
| 7/17/17 | 10605.561 |
| 7/18/17 | 10518.687 |
| 7/19/17 | 10423.305 |
| 7/20/17 | 10441.955 |
| 7/23/17 | 10552.828 |
| 7/24/17 | 10544.476 |
| 7/25/17 | 10777.907 |
| 7/26/17 | 10853.719 |
| 7/27/17 | 10853.719 |
| 7/30/17 | 10853.719 |
| 7/31/17 | 10853.719 |
| 8/1/17 | 10853.719 |
| 8/2/17 | 10853.719 |
| 8/3/17 | 10853.719 |
| 8/6/17 | 10853.719 |
| 8/7/17 | 10853.719 |
| 8/8/17 | 10833.883 |
| 8/9/17 | 10825.304 |
| 8/10/17 | 10981.559 |
| 8/13/17 | 10981.559 |
| 8/14/17 | 10981.559 |
| 8/15/17 | 10927.78 |
| 8/16/17 | 10954.97 |
| 8/17/17 | 10916.067 |
| 8/20/17 | 10999.514 |
| 8/21/17 | 10950.472 |
| 8/22/17 | 10947.946 |
| 8/23/17 | 10812.672 |
| 8/24/17 | 10816.252 |
| 8/27/17 | 10813.884 |
| 8/28/17 | 10950.281 |
| 8/29/17 | 10871.076 |
| 8/30/17 | 10976.174 |
| 8/31/17 | 10853.582 |
| 9/3/17 | 10833.949 |
| 9/4/17 | 10858.085 |
| 9/5/17 | 10773.261 |
| 9/6/17 | 10691.091 |
| 9/7/17 | 10889.712 |
| 9/10/17 | 10985.564 |
| 9/11/17 | 11036.386 |
| 9/12/17 | 11036.386 |
| 9/13/17 | 11036.386 |
| 9/14/17 | 11036.386 |
| 9/17/17 | 11036.386 |
| 9/18/17 | 11036.386 |
| 9/19/17 | 11036.386 |
| 9/20/17 | 11036.386 |
| 9/21/17 | 11036.386 |
| 9/24/17 | 11036.386 |
| 9/25/17 | 11036.386 |
| 9/26/17 | 11036.386 |
| 9/27/17 | 11036.386 |
| 9/28/17 | 11036.386 |
| 10/1/17 | 11036.386 |
| 10/2/17 | 11036.386 |
| 10/3/17 | 11036.386 |
| 10/4/17 | 11036.386 |
| 10/5/17 | 11036.386 |
| 10/8/17 | 11036.386 |
| 10/9/17 | 11036.386 |
| 10/10/17 | 11036.386 |
| 10/11/17 | 11036.386 |
| 10/12/17 | 11036.386 |
| 10/15/17 | 11036.386 |
| 10/16/17 | 11036.386 |
| 10/17/17 | 11036.386 |
| 10/18/17 | 11036.386 |
| 10/19/17 | 11036.386 |
| 10/22/17 | 11036.386 |
| 10/23/17 | 11024.785 |
| 10/24/17 | 10915.369 |
| 10/25/17 | 10926.478 |
| 10/26/17 | 10952.769 |
| 10/29/17 | 10876.656 |
| 10/30/17 | 10785.983 |
| 10/31/17 | 10911.976 |
| 11/1/17 | 10886.616 |
| 11/2/17 | 10912.264 |
| 11/6/17 | 10880.101 |
| 11/7/17 | 10883.847 |
| 11/8/17 | 10980.343 |
| 11/9/17 | 10931.009 |
| 11/10/17 | 10949.24 |
| 11/13/17 | 11050.244 |
| 11/14/17 | 11069.953 |
| 11/15/17 | 10963.516 |
| 11/16/17 | 11051.674 |
| 11/17/17 | 10962.986 |
| 11/20/17 | 10994.626 |
| 11/21/17 | 11135.645 |
| 11/22/17 | 11135.645 |
| 11/23/17 | 11135.645 |
| 11/24/17 | 11135.645 |
| 11/27/17 | 11135.645 |
| 11/28/17 | 11135.645 |
| 11/29/17 | 11117.953 |
| 11/30/17 | 11273.148 |
| 12/1/17 | 11273.148 |
| 12/4/17 | 11248.305 |
| 12/5/17 | 11215.459 |
| 12/6/17 | 11113.255 |
| 12/7/17 | 11173.967 |
| 12/8/17 | 11199.757 |
| 12/11/17 | 11205.689 |
| 12/12/17 | 11284.631 |
| 12/13/17 | 11219.717 |
| 12/14/17 | 11224.724 |
| 12/15/17 | 11290.788 |
| 12/18/17 | 11306.697 |
| 12/19/17 | 11271.973 |
| 12/20/17 | 11243.266 |
| 12/21/17 | 11239.573 |
| 12/22/17 | 11241.733 |
| 12/25/17 | 11229.207 |
| 12/26/17 | 11276.191 |
| 12/27/17 | 11400.675 |
| 12/28/17 | 11400.675 |
| 12/29/17 | 11400.675 |
| 1/1/18 | 11400.675 |
| 1/2/18 | 11400.675 |
| 1/3/18 | 11400.675 |
| 1/4/18 | 11400.675 |
| 1/5/18 | 11400.675 |
| 1/8/18 | 11400.675 |
| 1/9/18 | 11498.052 |
| 1/10/18 | 11498.052 |
| 1/11/18 | 11498.052 |
| 1/12/18 | 11498.052 |
| 1/15/18 | 11498.052 |
| 1/16/18 | 11498.052 |
| 1/17/18 | 11498.052 |
| 1/18/18 | 11498.052 |
| 1/19/18 | 11498.052 |
| 1/22/18 | 11498.052 |
| 1/23/18 | 11498.052 |
| 1/24/18 | 11403.6 |
| 1/25/18 | 11263.328 |
| 1/26/18 | 11317.262 |
| 1/29/18 | 11282.844 |
| 1/30/18 | 11227.883 |
| 1/31/18 | 11148.859 |
| 2/1/18 | 11202.041 |
| 2/2/18 | 11181.652 |
| 2/5/18 | 11259.05 |
| 2/6/18 | 11389.617 |
| 2/7/18 | 11253.318 |
| 2/8/18 | 11291.299 |
| 2/9/18 | 11289.88 |
| 2/12/18 | 11224.299 |
| 2/13/18 | 11152.975 |
| 2/14/18 | 11036.678 |
| 2/15/18 | 11113.782 |
| 2/16/18 | 11146.262 |
| 2/19/18 | 11269.804 |
| 2/20/18 | 11306.458 |
| 2/21/18 | 11204.017 |
| 2/22/18 | 11264.051 |
| 2/23/18 | 11300.695 |
| 2/26/18 | 11303.678 |
| 2/27/18 | 11372.756 |
| 2/28/18 | 11320.889 |
| 3/1/18 | 11256.097 |
| 3/2/18 | 11310.362 |
| 3/5/18 | 11333.233 |
| 3/6/18 | 11382.949 |
| 3/7/18 | 11502.352 |
| 3/8/18 | 11513.988 |
| 3/9/18 | 11461.504 |
| 3/11/18 | 11413.731 |
| 3/12/18 | 11428.543 |
| 3/13/18 | 11541.645 |
| 3/14/18 | 11549.519 |
| 3/15/18 | 11554.874 |
| 3/18/18 | 11649.004 |
| 3/19/18 | 11649.004 |
| 3/20/18 | 11630.036 |
| 3/21/18 | 11597.358 |
| 3/22/18 | 11591.489 |
| 3/25/18 | 11599.984 |
| 3/26/18 | 11762.694 |
| 3/27/18 | 11762.694 |
| 3/28/18 | 11762.694 |
| 3/29/18 | 11762.694 |
| 4/1/18 | 11762.694 |
| 4/2/18 | 11762.694 |
| 4/3/18 | 11762.694 |
| 4/4/18 | 11762.694 |
| 4/5/18 | 11762.694 |
| 4/8/18 | 11762.694 |
| 4/9/18 | 11762.694 |
| 4/10/18 | 11762.694 |
| 4/11/18 | 11762.694 |
| 4/12/18 | 11762.694 |
| 4/15/18 | 11762.694 |
| 4/16/18 | 11762.694 |
| 4/17/18 | 11762.694 |
| 4/18/18 | 11762.694 |
| 4/19/18 | 11711.843 |
| 4/22/18 | 11686.37 |
| 4/23/18 | 11621.687 |
| 4/24/18 | 11513.109 |
| 4/25/18 | 11584.488 |
| 4/26/18 | 11527.48 |
| 4/29/18 | 11474.629 |
| 4/30/18 | 11450.454 |
| 5/1/18 | 11473.761 |
| 5/2/18 | 11444.426 |
| 5/3/18 | 11384.258 |
| 5/6/18 | 11404.286 |
| 5/7/18 | 11338.599 |
| 5/8/18 | 11385.962 |
| 5/9/18 | 11438.407 |
| 5/10/18 | 11423.122 |
| 5/13/18 | 11425.302 |
| 5/14/18 | 11433.337 |
| 5/15/18 | 11418.789 |
| 5/16/18 | 11513.961 |
| 5/17/18 | 11519.797 |
| 5/20/18 | 11598.168 |
| 5/21/18 | 11574.005 |
| 5/22/18 | 11634.651 |
| 5/23/18 | 11694.66 |
| 5/24/18 | 11624.506 |
| 5/27/18 | 11685.155 |
| 5/28/18 | 11707.325 |
| 5/29/18 | 11763.039 |
| 5/30/18 | 11711.321 |
| 5/31/18 | 11724.875 |
| 6/3/18 | 11752.573 |
| 6/4/18 | 11717.539 |
| 6/5/18 | 11818.827 |
| 6/6/18 | 11818.827 |
| 6/7/18 | 11818.974 |
| 6/10/18 | 11798.109 |
| 6/11/18 | 11819.643 |
| 6/12/18 | 11657.461 |
| 6/13/18 | 11636.305 |
| 6/14/18 | 11689.38 |
| 6/17/18 | 11725.899 |
| 6/18/18 | 11692.307 |
| 6/19/18 | 11747.521 |
| 6/20/18 | 11813.124 |
| 6/21/18 | 11819.186 |
| 6/24/18 | 11761.186 |
| 6/25/18 | 11695.796 |
| 6/26/18 | 11700.488 |
| 6/27/18 | 11783.185 |
| 6/28/18 | 11747.566 |
| 7/1/18 | 11750.351 |
| 7/2/18 | 11744.103 |
| 7/3/18 | 11729.916 |
| 7/4/18 | 11772.26 |
| 7/5/18 | 11750.424 |
| 7/8/18 | 11737.079 |
| 7/9/18 | 11688.695 |
| 7/10/18 | 11576.7 |
| 7/11/18 | 11586.918 |
| 7/12/18 | 11666.163 |
| 7/15/18 | 11643.778 |
| 7/16/18 | 11676.782 |
| 7/17/18 | 11698.47 |
| 7/18/18 | 11772.535 |
| 7/19/18 | 11777.014 |
| 7/22/18 | 11746.306 |
| 7/23/18 | 11766.491 |
| 7/24/18 | 11750.51 |
| 7/25/18 | 11760.114 |
| 7/26/18 | 11844.585 |
| 7/29/18 | 11814.454 |
| 7/30/18 | 11778.671 |
| 7/31/18 | 11759.858 |
| 8/1/18 | 11777.652 |
| 8/2/18 | 11754.631 |
| 8/5/18 | 11775.497 |
| 8/6/18 | 11832.149 |
| 8/7/18 | 11845.932 |
| 8/8/18 | 11834.829 |
| 8/9/18 | 11867.219 |
| 8/12/18 | 11867.219 |
| 8/13/18 | 11867.219 |
| 8/14/18 | 11867.219 |
| 8/15/18 | 11889.907 |
| 8/16/18 | 11941.653 |
| 8/19/18 | 11941.653 |
| 8/20/18 | 11941.653 |
| 8/21/18 | 11941.653 |
| 8/22/18 | 11941.653 |
| 8/23/18 | 11941.653 |
| 8/26/18 | 11941.653 |
| 8/27/18 | 11941.653 |
| 8/28/18 | 11941.653 |
| 8/29/18 | 11941.653 |
| 8/30/18 | 11941.653 |
| 9/2/18 | 11941.653 |
| 9/3/18 | 11941.653 |
| 9/4/18 | 11941.653 |
| 9/5/18 | 12009.373 |
| 9/6/18 | 12009.373 |
| 9/9/18 | 12009.373 |
| 9/10/18 | 12009.373 |
| 9/11/18 | 12009.373 |
| 9/12/18 | 12009.373 |
| 9/13/18 | 12009.373 |
| 9/16/18 | 12042.32 |
| 9/17/18 | 12042.32 |
| 9/18/18 | 12042.32 |
| 9/19/18 | 11982.907 |
| 9/20/18 | 12095.294 |
| 9/23/18 | 12126.956 |
| 9/24/18 | 12126.956 |
| 9/25/18 | 12126.956 |
| 9/26/18 | 12126.956 |
| 9/27/18 | 12126.956 |
| 9/30/18 | 12126.956 |
| 10/1/18 | 12126.956 |
| 10/2/18 | 12114.318 |
| 10/3/18 | 12081.497 |
| 10/4/18 | 12081.523 |
| 10/7/18 | 12074.13 |
| 10/8/18 | 12089.013 |
| 10/9/18 | 12089.801 |
| 10/10/18 | 12076.66 |
| 10/11/18 | 12155.039 |
| 10/14/18 | 12155.039 |
| 10/15/18 | 12094.818 |
| 10/16/18 | 12117.738 |
| 10/17/18 | 12093.032 |
| 10/18/18 | 12119.097 |
| 10/21/18 | 12142.757 |
| 10/22/18 | 12124.024 |
| 10/23/18 | 12118.841 |
| 10/24/18 | 12154.265 |
| 10/25/18 | 12082.846 |
| 10/28/18 | 12062.065 |
| 10/29/18 | 11980.052 |
| 10/30/18 | 12011.301 |
| 10/31/18 | 12003.506 |
| 11/1/18 | 11960.453 |
| 11/5/18 | 11975.838 |
| 11/6/18 | 11975.143 |
| 11/7/18 | 11928.529 |
| 11/8/18 | 11968.19 |
| 11/9/18 | 11912.139 |
| 11/12/18 | 11940.32 |
| 11/13/18 | 11953.007 |
| 11/14/18 | 12008.762 |
| 11/15/18 | 12103.906 |
| 11/16/18 | 12204.934 |
| 11/19/18 | 12199.088 |
| 11/20/18 | 12210.841 |
| 11/21/18 | 12187.433 |
| 11/22/18 | 12168.68 |
| 11/23/18 | 12135.722 |
| 11/26/18 | 12155.151 |
| 11/27/18 | 12211.516 |
| 11/28/18 | 12189.215 |
| 11/29/18 | 12149.071 |
| 11/30/18 | 12178.663 |
| 12/3/18 | 12197.3 |
| 12/4/18 | 12170.149 |
| 12/5/18 | 12242.419 |
| 12/6/18 | 12242.419 |
| 12/7/18 | 12242.419 |
| 12/10/18 | 12242.419 |
| 12/11/18 | 12242.419 |
| 12/12/18 | 12242.419 |
| 12/13/18 | 12242.419 |
| 12/14/18 | 12324.644 |
| 12/17/18 | 12324.644 |
| 12/18/18 | 12324.644 |
| 12/19/18 | 12324.644 |
| 12/20/18 | 12324.644 |
| 12/21/18 | 12324.644 |
| 12/24/18 | 12324.644 |
| 12/25/18 | 12324.644 |
| 12/26/18 | 12324.644 |
| 12/27/18 | 12324.644 |
| 12/28/18 | 12324.644 |
| 12/31/18 | 12324.644 |
| 1/1/19 | 12324.644 |
| 1/2/19 | 12324.644 |
| 1/3/19 | 12324.644 |
| 1/4/19 | 12324.644 |
| 1/7/19 | 12324.644 |
| 1/8/19 | 12324.644 |
| 1/9/19 | 12324.644 |
| 1/10/19 | 12324.644 |
| 1/11/19 | 12324.644 |
| 1/14/19 | 12324.644 |
| 1/15/19 | 12324.644 |
| 1/16/19 | 12324.644 |
| 1/17/19 | 12329.535 |
| 1/18/19 | 12289.718 |
| 1/21/19 | 12267.62 |
| 1/22/19 | 12278.126 |
| 1/23/19 | 12258.042 |
| 1/24/19 | 12278.269 |
| 1/25/19 | 12302.419 |
| 1/28/19 | 12281.068 |
| 1/29/19 | 12276.347 |
| 1/30/19 | 12281.19 |
| 1/31/19 | 12263.738 |
| 2/1/19 | 12239.013 |
| 2/4/19 | 12238.667 |
| 2/5/19 | 12201.385 |
| 2/6/19 | 12201.198 |
| 2/7/19 | 12201.198 |